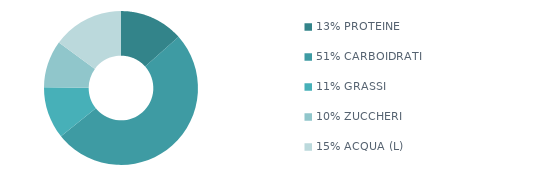
| Category | Series 0 |
|---|---|
| 13% PROTEINE | 915 |
| 51% CARBOIDRATI | 3460 |
| 11% GRASSI | 745 |
| 10% ZUCCHERI | 675 |
| 15% ACQUA (L) | 1018 |